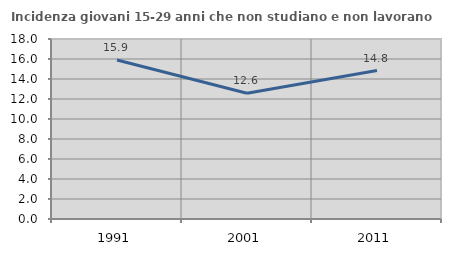
| Category | Incidenza giovani 15-29 anni che non studiano e non lavorano  |
|---|---|
| 1991.0 | 15.899 |
| 2001.0 | 12.579 |
| 2011.0 | 14.841 |